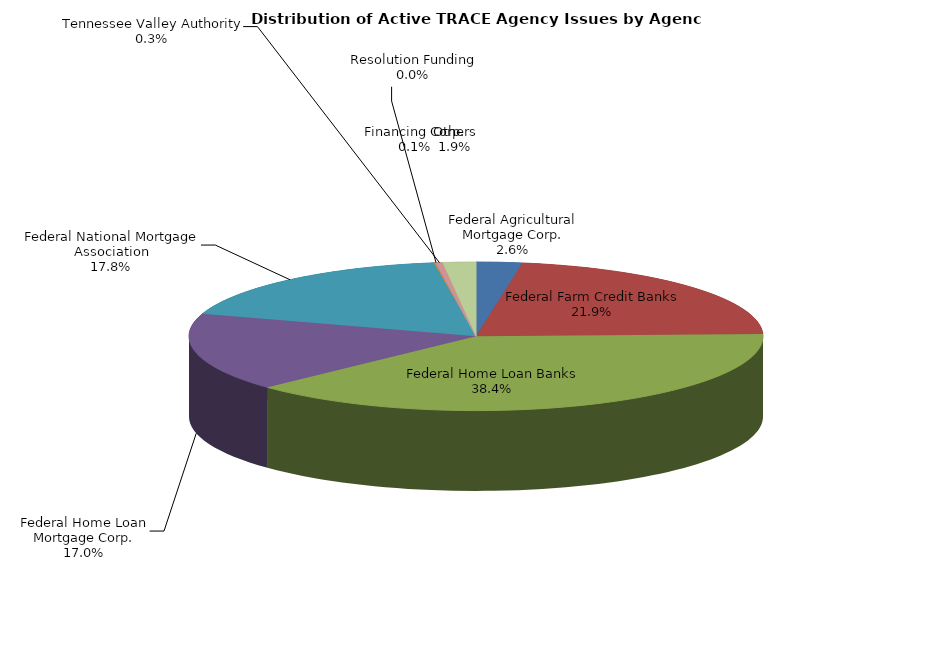
| Category | Series 0 |
|---|---|
| Federal Agricultural Mortgage Corp. | 355 |
| Federal Farm Credit Banks | 3016 |
| Federal Home Loan Banks | 5292 |
| Federal Home Loan Mortgage Corp. | 2334 |
| Federal National Mortgage Association | 2444 |
| Financing Corp. | 14 |
| Resolution Funding | 6 |
| Tennessee Valley Authority | 46 |
| Others | 257 |